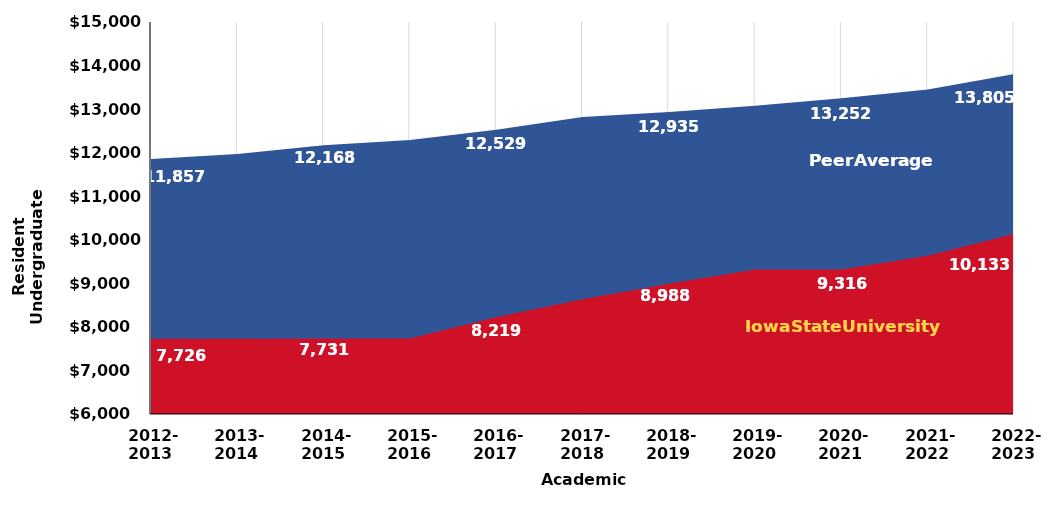
| Category | Peer Average | Iowa State University |
|---|---|---|
|  2012-
2013 | 11856.7 | 7726 |
|  2013-
2014 | 11970.78 | 7726 |
|  2014-
2015 | 12168.48 | 7731.4 |
|  2015-
2016 | 12290.456 | 7735.9 |
|  2016-
2017 | 12528.628 | 8219.4 |
|  2017-
2018 | 12817.8 | 8635.9 |
|  2018-
2019 | 12935.492 | 8988.4 |
|  2019-
2020 | 13077.572 | 9319.9 |
|  2020-
2021 | 13252 | 9316 |
|  2021-
2022 | 13447.912 | 9633.9 |
|  2022-
2023 | 13805.196 | 10133 |